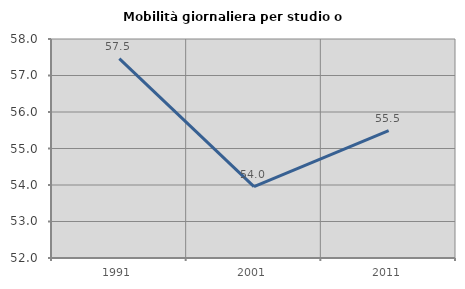
| Category | Mobilità giornaliera per studio o lavoro |
|---|---|
| 1991.0 | 57.464 |
| 2001.0 | 53.953 |
| 2011.0 | 55.489 |